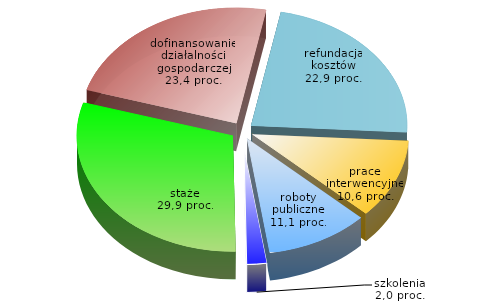
| Category | proc. |
|---|---|
| Staże | 29.926 |
| Dofinansowanie działalności gospodarczej | 23.413 |
| Refundacja kosztów wyposażenia lub doposażenia miejsca pracy | 22.859 |
| Roboty publiczne | 11.108 |
| Prace interwencyjne | 10.645 |
| Szkolenia | 2.049 |